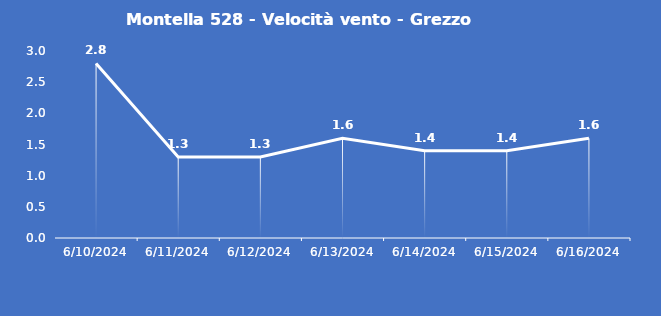
| Category | Montella 528 - Velocità vento - Grezzo (m/s) |
|---|---|
| 6/10/24 | 2.8 |
| 6/11/24 | 1.3 |
| 6/12/24 | 1.3 |
| 6/13/24 | 1.6 |
| 6/14/24 | 1.4 |
| 6/15/24 | 1.4 |
| 6/16/24 | 1.6 |